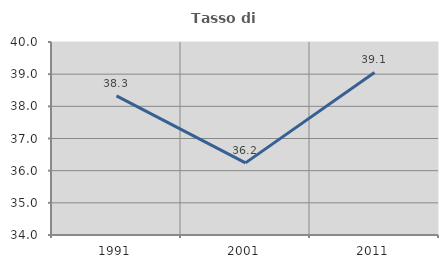
| Category | Tasso di occupazione   |
|---|---|
| 1991.0 | 38.327 |
| 2001.0 | 36.242 |
| 2011.0 | 39.054 |